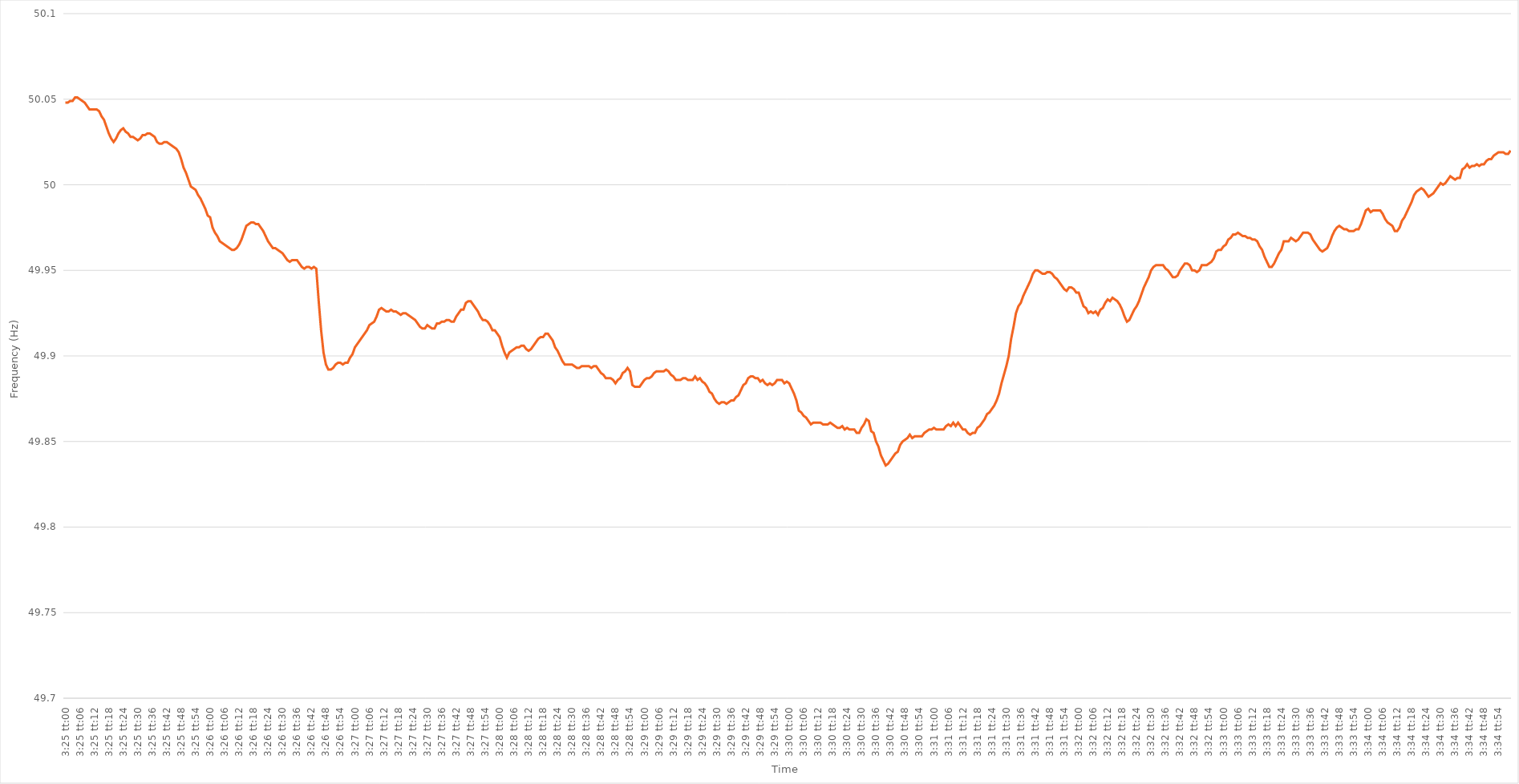
| Category | Series 0 |
|---|---|
| 0.1423611111111111 | 50.048 |
| 0.14237268518518517 | 50.048 |
| 0.14238425925925927 | 50.049 |
| 0.14239583333333333 | 50.049 |
| 0.1424074074074074 | 50.051 |
| 0.1424189814814815 | 50.051 |
| 0.14243055555555556 | 50.05 |
| 0.14244212962962963 | 50.049 |
| 0.1424537037037037 | 50.048 |
| 0.14246527777777776 | 50.046 |
| 0.14247685185185185 | 50.044 |
| 0.14248842592592592 | 50.044 |
| 0.1425 | 50.044 |
| 0.14251157407407408 | 50.044 |
| 0.14252314814814815 | 50.043 |
| 0.14253472222222222 | 50.04 |
| 0.1425462962962963 | 50.038 |
| 0.14255787037037038 | 50.034 |
| 0.14256944444444444 | 50.03 |
| 0.14258101851851854 | 50.027 |
| 0.14259259259259258 | 50.025 |
| 0.14260416666666667 | 50.027 |
| 0.14261574074074074 | 50.03 |
| 0.1426273148148148 | 50.032 |
| 0.1426388888888889 | 50.033 |
| 0.14265046296296297 | 50.031 |
| 0.14266203703703703 | 50.03 |
| 0.14267361111111113 | 50.028 |
| 0.14268518518518516 | 50.028 |
| 0.14269675925925926 | 50.027 |
| 0.14270833333333333 | 50.026 |
| 0.1427199074074074 | 50.027 |
| 0.1427314814814815 | 50.029 |
| 0.14274305555555555 | 50.029 |
| 0.14275462962962962 | 50.03 |
| 0.14276620370370371 | 50.03 |
| 0.14277777777777778 | 50.029 |
| 0.14278935185185185 | 50.028 |
| 0.14280092592592594 | 50.025 |
| 0.1428125 | 50.024 |
| 0.14282407407407408 | 50.024 |
| 0.14283564814814814 | 50.025 |
| 0.1428472222222222 | 50.025 |
| 0.1428587962962963 | 50.024 |
| 0.14287037037037037 | 50.023 |
| 0.14288194444444444 | 50.022 |
| 0.14289351851851853 | 50.021 |
| 0.1429050925925926 | 50.019 |
| 0.14291666666666666 | 50.015 |
| 0.14292824074074073 | 50.01 |
| 0.1429398148148148 | 50.007 |
| 0.1429513888888889 | 50.003 |
| 0.14296296296296296 | 49.999 |
| 0.14297453703703702 | 49.998 |
| 0.14298611111111112 | 49.997 |
| 0.14299768518518519 | 49.994 |
| 0.14300925925925925 | 49.992 |
| 0.14302083333333335 | 49.989 |
| 0.1430324074074074 | 49.986 |
| 0.14304398148148148 | 49.982 |
| 0.14305555555555557 | 49.981 |
| 0.1430671296296296 | 49.975 |
| 0.1430787037037037 | 49.972 |
| 0.14309027777777777 | 49.97 |
| 0.14310185185185184 | 49.967 |
| 0.14311342592592594 | 49.966 |
| 0.143125 | 49.965 |
| 0.14313657407407407 | 49.964 |
| 0.14314814814814816 | 49.963 |
| 0.1431597222222222 | 49.962 |
| 0.1431712962962963 | 49.962 |
| 0.14318287037037036 | 49.963 |
| 0.14319444444444443 | 49.965 |
| 0.14320601851851852 | 49.968 |
| 0.1432175925925926 | 49.972 |
| 0.14322916666666666 | 49.976 |
| 0.14324074074074075 | 49.977 |
| 0.14325231481481482 | 49.978 |
| 0.14326388888888889 | 49.978 |
| 0.14327546296296298 | 49.977 |
| 0.14328703703703705 | 49.977 |
| 0.1432986111111111 | 49.975 |
| 0.14331018518518518 | 49.973 |
| 0.14332175925925925 | 49.97 |
| 0.14333333333333334 | 49.967 |
| 0.1433449074074074 | 49.965 |
| 0.14335648148148147 | 49.963 |
| 0.14336805555555557 | 49.963 |
| 0.14337962962962963 | 49.962 |
| 0.1433912037037037 | 49.961 |
| 0.14340277777777777 | 49.96 |
| 0.14341435185185183 | 49.958 |
| 0.14342592592592593 | 49.956 |
| 0.1434375 | 49.955 |
| 0.14344907407407406 | 49.956 |
| 0.14346064814814816 | 49.956 |
| 0.14347222222222222 | 49.956 |
| 0.1434837962962963 | 49.954 |
| 0.14349537037037038 | 49.952 |
| 0.14350694444444445 | 49.951 |
| 0.14351851851851852 | 49.952 |
| 0.1435300925925926 | 49.952 |
| 0.14354166666666665 | 49.951 |
| 0.14355324074074075 | 49.952 |
| 0.1435648148148148 | 49.951 |
| 0.14357638888888888 | 49.932 |
| 0.14358796296296297 | 49.915 |
| 0.14359953703703704 | 49.902 |
| 0.1436111111111111 | 49.895 |
| 0.1436226851851852 | 49.892 |
| 0.14363425925925924 | 49.892 |
| 0.14364583333333333 | 49.893 |
| 0.1436574074074074 | 49.895 |
| 0.14366898148148147 | 49.896 |
| 0.14368055555555556 | 49.896 |
| 0.14369212962962963 | 49.895 |
| 0.1437037037037037 | 49.896 |
| 0.1437152777777778 | 49.896 |
| 0.14372685185185186 | 49.899 |
| 0.14373842592592592 | 49.901 |
| 0.14375000000000002 | 49.905 |
| 0.14376157407407408 | 49.907 |
| 0.14377314814814815 | 49.909 |
| 0.14378472222222222 | 49.911 |
| 0.14379629629629628 | 49.913 |
| 0.14380787037037038 | 49.915 |
| 0.14381944444444444 | 49.918 |
| 0.1438310185185185 | 49.919 |
| 0.1438425925925926 | 49.92 |
| 0.14385416666666667 | 49.923 |
| 0.14386574074074074 | 49.927 |
| 0.1438773148148148 | 49.928 |
| 0.14388888888888887 | 49.927 |
| 0.14390046296296297 | 49.926 |
| 0.14391203703703703 | 49.926 |
| 0.1439236111111111 | 49.927 |
| 0.1439351851851852 | 49.926 |
| 0.14394675925925926 | 49.926 |
| 0.14395833333333333 | 49.925 |
| 0.14396990740740742 | 49.924 |
| 0.1439814814814815 | 49.925 |
| 0.14399305555555555 | 49.925 |
| 0.14400462962962965 | 49.924 |
| 0.1440162037037037 | 49.923 |
| 0.14402777777777778 | 49.922 |
| 0.14403935185185185 | 49.921 |
| 0.14405092592592592 | 49.919 |
| 0.1440625 | 49.917 |
| 0.14407407407407408 | 49.916 |
| 0.14408564814814814 | 49.916 |
| 0.14409722222222224 | 49.918 |
| 0.14410879629629628 | 49.917 |
| 0.14412037037037037 | 49.916 |
| 0.14413194444444444 | 49.916 |
| 0.1441435185185185 | 49.919 |
| 0.1441550925925926 | 49.919 |
| 0.14416666666666667 | 49.92 |
| 0.14417824074074073 | 49.92 |
| 0.14418981481481483 | 49.921 |
| 0.1442013888888889 | 49.921 |
| 0.14421296296296296 | 49.92 |
| 0.14422453703703705 | 49.92 |
| 0.14423611111111112 | 49.923 |
| 0.1442476851851852 | 49.925 |
| 0.14425925925925925 | 49.927 |
| 0.14427083333333332 | 49.927 |
| 0.14428240740740741 | 49.931 |
| 0.14429398148148148 | 49.932 |
| 0.14430555555555555 | 49.932 |
| 0.14431712962962964 | 49.93 |
| 0.1443287037037037 | 49.928 |
| 0.14434027777777778 | 49.926 |
| 0.14435185185185184 | 49.923 |
| 0.1443634259259259 | 49.921 |
| 0.144375 | 49.921 |
| 0.14438657407407407 | 49.92 |
| 0.14439814814814814 | 49.918 |
| 0.14440972222222223 | 49.915 |
| 0.1444212962962963 | 49.915 |
| 0.14443287037037036 | 49.913 |
| 0.14444444444444446 | 49.911 |
| 0.14445601851851853 | 49.906 |
| 0.1444675925925926 | 49.902 |
| 0.1444791666666667 | 49.899 |
| 0.14449074074074073 | 49.902 |
| 0.14450231481481482 | 49.903 |
| 0.1445138888888889 | 49.904 |
| 0.14452546296296295 | 49.905 |
| 0.14453703703703705 | 49.905 |
| 0.1445486111111111 | 49.906 |
| 0.14456018518518518 | 49.906 |
| 0.14457175925925927 | 49.904 |
| 0.1445833333333333 | 49.903 |
| 0.1445949074074074 | 49.904 |
| 0.14460648148148147 | 49.906 |
| 0.14461805555555554 | 49.908 |
| 0.14462962962962964 | 49.91 |
| 0.1446412037037037 | 49.911 |
| 0.14465277777777777 | 49.911 |
| 0.14466435185185186 | 49.913 |
| 0.14467592592592593 | 49.913 |
| 0.1446875 | 49.911 |
| 0.1446990740740741 | 49.909 |
| 0.14471064814814816 | 49.905 |
| 0.14472222222222222 | 49.903 |
| 0.1447337962962963 | 49.9 |
| 0.14474537037037036 | 49.897 |
| 0.14475694444444445 | 49.895 |
| 0.14476851851851852 | 49.895 |
| 0.14478009259259259 | 49.895 |
| 0.14479166666666668 | 49.895 |
| 0.14480324074074075 | 49.894 |
| 0.1448148148148148 | 49.893 |
| 0.14482638888888888 | 49.893 |
| 0.14483796296296295 | 49.894 |
| 0.14484953703703704 | 49.894 |
| 0.1448611111111111 | 49.894 |
| 0.14487268518518517 | 49.894 |
| 0.14488425925925927 | 49.893 |
| 0.14489583333333333 | 49.894 |
| 0.1449074074074074 | 49.894 |
| 0.1449189814814815 | 49.892 |
| 0.14493055555555556 | 49.89 |
| 0.14494212962962963 | 49.889 |
| 0.14495370370370372 | 49.887 |
| 0.14496527777777776 | 49.887 |
| 0.14497685185185186 | 49.887 |
| 0.14498842592592592 | 49.886 |
| 0.145 | 49.884 |
| 0.14501157407407408 | 49.886 |
| 0.14502314814814815 | 49.887 |
| 0.14503472222222222 | 49.89 |
| 0.1450462962962963 | 49.891 |
| 0.14505787037037035 | 49.893 |
| 0.14506944444444445 | 49.891 |
| 0.1450810185185185 | 49.883 |
| 0.14509259259259258 | 49.882 |
| 0.14510416666666667 | 49.882 |
| 0.14511574074074074 | 49.882 |
| 0.1451273148148148 | 49.884 |
| 0.1451388888888889 | 49.886 |
| 0.14515046296296297 | 49.887 |
| 0.14516203703703703 | 49.887 |
| 0.14517361111111113 | 49.888 |
| 0.1451851851851852 | 49.89 |
| 0.14519675925925926 | 49.891 |
| 0.14520833333333333 | 49.891 |
| 0.1452199074074074 | 49.891 |
| 0.1452314814814815 | 49.891 |
| 0.14524305555555556 | 49.892 |
| 0.14525462962962962 | 49.891 |
| 0.14526620370370372 | 49.889 |
| 0.14527777777777778 | 49.888 |
| 0.14528935185185185 | 49.886 |
| 0.14530092592592592 | 49.886 |
| 0.14531249999999998 | 49.886 |
| 0.14532407407407408 | 49.887 |
| 0.14533564814814814 | 49.887 |
| 0.1453472222222222 | 49.886 |
| 0.1453587962962963 | 49.886 |
| 0.14537037037037037 | 49.886 |
| 0.14538194444444444 | 49.888 |
| 0.14539351851851853 | 49.886 |
| 0.1454050925925926 | 49.887 |
| 0.14541666666666667 | 49.885 |
| 0.14542824074074076 | 49.884 |
| 0.1454398148148148 | 49.882 |
| 0.1454513888888889 | 49.879 |
| 0.14546296296296296 | 49.878 |
| 0.14547453703703703 | 49.875 |
| 0.14548611111111112 | 49.873 |
| 0.1454976851851852 | 49.872 |
| 0.14550925925925925 | 49.873 |
| 0.14552083333333335 | 49.873 |
| 0.1455324074074074 | 49.872 |
| 0.14554398148148148 | 49.873 |
| 0.14555555555555555 | 49.874 |
| 0.14556712962962962 | 49.874 |
| 0.1455787037037037 | 49.876 |
| 0.14559027777777778 | 49.877 |
| 0.14560185185185184 | 49.88 |
| 0.14561342592592594 | 49.883 |
| 0.145625 | 49.884 |
| 0.14563657407407407 | 49.887 |
| 0.14564814814814817 | 49.888 |
| 0.14565972222222223 | 49.888 |
| 0.1456712962962963 | 49.887 |
| 0.14568287037037037 | 49.887 |
| 0.14569444444444443 | 49.885 |
| 0.14570601851851853 | 49.886 |
| 0.1457175925925926 | 49.884 |
| 0.14572916666666666 | 49.883 |
| 0.14574074074074075 | 49.884 |
| 0.14575231481481482 | 49.883 |
| 0.1457638888888889 | 49.884 |
| 0.14577546296296295 | 49.886 |
| 0.14578703703703702 | 49.886 |
| 0.14579861111111111 | 49.886 |
| 0.14581018518518518 | 49.884 |
| 0.14582175925925925 | 49.885 |
| 0.14583333333333334 | 49.884 |
| 0.1458449074074074 | 49.881 |
| 0.14585648148148148 | 49.878 |
| 0.14586805555555557 | 49.874 |
| 0.14587962962962964 | 49.868 |
| 0.1458912037037037 | 49.867 |
| 0.1459027777777778 | 49.865 |
| 0.14591435185185184 | 49.864 |
| 0.14592592592592593 | 49.862 |
| 0.1459375 | 49.86 |
| 0.14594907407407406 | 49.861 |
| 0.14596064814814816 | 49.861 |
| 0.14597222222222223 | 49.861 |
| 0.1459837962962963 | 49.861 |
| 0.1459953703703704 | 49.86 |
| 0.14600694444444443 | 49.86 |
| 0.14601851851851852 | 49.86 |
| 0.1460300925925926 | 49.861 |
| 0.14604166666666665 | 49.86 |
| 0.14605324074074075 | 49.859 |
| 0.14606481481481481 | 49.858 |
| 0.14607638888888888 | 49.858 |
| 0.14608796296296298 | 49.859 |
| 0.14609953703703704 | 49.857 |
| 0.1461111111111111 | 49.858 |
| 0.1461226851851852 | 49.857 |
| 0.14613425925925927 | 49.857 |
| 0.14614583333333334 | 49.857 |
| 0.1461574074074074 | 49.855 |
| 0.14616898148148147 | 49.855 |
| 0.14618055555555556 | 49.858 |
| 0.14619212962962963 | 49.86 |
| 0.1462037037037037 | 49.863 |
| 0.1462152777777778 | 49.862 |
| 0.14622685185185186 | 49.856 |
| 0.14623842592592592 | 49.855 |
| 0.14625 | 49.85 |
| 0.14626157407407406 | 49.847 |
| 0.14627314814814815 | 49.842 |
| 0.14628472222222222 | 49.839 |
| 0.14629629629629629 | 49.836 |
| 0.14630787037037038 | 49.837 |
| 0.14631944444444445 | 49.839 |
| 0.1463310185185185 | 49.841 |
| 0.1463425925925926 | 49.843 |
| 0.14635416666666667 | 49.844 |
| 0.14636574074074074 | 49.848 |
| 0.14637731481481484 | 49.85 |
| 0.14638888888888887 | 49.851 |
| 0.14640046296296297 | 49.852 |
| 0.14641203703703703 | 49.854 |
| 0.1464236111111111 | 49.852 |
| 0.1464351851851852 | 49.853 |
| 0.14644675925925926 | 49.853 |
| 0.14645833333333333 | 49.853 |
| 0.14646990740740742 | 49.853 |
| 0.14648148148148146 | 49.855 |
| 0.14649305555555556 | 49.856 |
| 0.14650462962962962 | 49.857 |
| 0.1465162037037037 | 49.857 |
| 0.14652777777777778 | 49.858 |
| 0.14653935185185185 | 49.857 |
| 0.14655092592592592 | 49.857 |
| 0.1465625 | 49.857 |
| 0.14657407407407408 | 49.857 |
| 0.14658564814814815 | 49.859 |
| 0.14659722222222224 | 49.86 |
| 0.1466087962962963 | 49.859 |
| 0.14662037037037037 | 49.861 |
| 0.14663194444444444 | 49.859 |
| 0.1466435185185185 | 49.861 |
| 0.1466550925925926 | 49.859 |
| 0.14666666666666667 | 49.857 |
| 0.14667824074074073 | 49.857 |
| 0.14668981481481483 | 49.855 |
| 0.1467013888888889 | 49.854 |
| 0.14671296296296296 | 49.855 |
| 0.14672453703703703 | 49.855 |
| 0.1467361111111111 | 49.858 |
| 0.1467476851851852 | 49.859 |
| 0.14675925925925926 | 49.861 |
| 0.14677083333333332 | 49.863 |
| 0.14678240740740742 | 49.866 |
| 0.14679398148148148 | 49.867 |
| 0.14680555555555555 | 49.869 |
| 0.14681712962962964 | 49.871 |
| 0.1468287037037037 | 49.874 |
| 0.14684027777777778 | 49.878 |
| 0.14685185185185184 | 49.884 |
| 0.1468634259259259 | 49.889 |
| 0.146875 | 49.894 |
| 0.14688657407407407 | 49.9 |
| 0.14689814814814814 | 49.91 |
| 0.14690972222222223 | 49.917 |
| 0.1469212962962963 | 49.925 |
| 0.14693287037037037 | 49.929 |
| 0.14694444444444446 | 49.931 |
| 0.1469560185185185 | 49.935 |
| 0.1469675925925926 | 49.938 |
| 0.14697916666666666 | 49.941 |
| 0.14699074074074073 | 49.944 |
| 0.14700231481481482 | 49.948 |
| 0.1470138888888889 | 49.95 |
| 0.14702546296296296 | 49.95 |
| 0.14703703703703705 | 49.949 |
| 0.14704861111111112 | 49.948 |
| 0.14706018518518518 | 49.948 |
| 0.14707175925925928 | 49.949 |
| 0.14708333333333334 | 49.949 |
| 0.1470949074074074 | 49.948 |
| 0.14710648148148148 | 49.946 |
| 0.14711805555555554 | 49.945 |
| 0.14712962962962964 | 49.943 |
| 0.1471412037037037 | 49.941 |
| 0.14715277777777777 | 49.939 |
| 0.14716435185185187 | 49.938 |
| 0.14717592592592593 | 49.94 |
| 0.1471875 | 49.94 |
| 0.14719907407407407 | 49.939 |
| 0.14721064814814813 | 49.937 |
| 0.14722222222222223 | 49.937 |
| 0.1472337962962963 | 49.933 |
| 0.14724537037037036 | 49.929 |
| 0.14725694444444445 | 49.928 |
| 0.14726851851851852 | 49.925 |
| 0.1472800925925926 | 49.926 |
| 0.14729166666666668 | 49.925 |
| 0.14730324074074075 | 49.926 |
| 0.14731481481481482 | 49.924 |
| 0.14732638888888888 | 49.927 |
| 0.14733796296296295 | 49.928 |
| 0.14734953703703704 | 49.931 |
| 0.1473611111111111 | 49.933 |
| 0.14737268518518518 | 49.932 |
| 0.14738425925925927 | 49.934 |
| 0.14739583333333334 | 49.933 |
| 0.1474074074074074 | 49.932 |
| 0.14741898148148147 | 49.93 |
| 0.14743055555555554 | 49.927 |
| 0.14744212962962963 | 49.923 |
| 0.1474537037037037 | 49.92 |
| 0.14746527777777776 | 49.921 |
| 0.14747685185185186 | 49.924 |
| 0.14748842592592593 | 49.927 |
| 0.1475 | 49.929 |
| 0.1475115740740741 | 49.932 |
| 0.14752314814814815 | 49.936 |
| 0.14753472222222222 | 49.94 |
| 0.14754629629629631 | 49.943 |
| 0.14755787037037038 | 49.946 |
| 0.14756944444444445 | 49.95 |
| 0.14758101851851851 | 49.952 |
| 0.14759259259259258 | 49.953 |
| 0.14760416666666668 | 49.953 |
| 0.14761574074074074 | 49.953 |
| 0.1476273148148148 | 49.953 |
| 0.1476388888888889 | 49.951 |
| 0.14765046296296297 | 49.95 |
| 0.14766203703703704 | 49.948 |
| 0.1476736111111111 | 49.946 |
| 0.14768518518518517 | 49.946 |
| 0.14769675925925926 | 49.947 |
| 0.14770833333333333 | 49.95 |
| 0.1477199074074074 | 49.952 |
| 0.1477314814814815 | 49.954 |
| 0.14774305555555556 | 49.954 |
| 0.14775462962962962 | 49.953 |
| 0.14776620370370372 | 49.95 |
| 0.14777777777777779 | 49.95 |
| 0.14778935185185185 | 49.949 |
| 0.14780092592592595 | 49.95 |
| 0.14781249999999999 | 49.953 |
| 0.14782407407407408 | 49.953 |
| 0.14783564814814815 | 49.953 |
| 0.1478472222222222 | 49.954 |
| 0.1478587962962963 | 49.955 |
| 0.14787037037037037 | 49.957 |
| 0.14788194444444444 | 49.961 |
| 0.14789351851851854 | 49.962 |
| 0.14790509259259257 | 49.962 |
| 0.14791666666666667 | 49.964 |
| 0.14792824074074074 | 49.965 |
| 0.1479398148148148 | 49.968 |
| 0.1479513888888889 | 49.969 |
| 0.14796296296296296 | 49.971 |
| 0.14797453703703703 | 49.971 |
| 0.14798611111111112 | 49.972 |
| 0.1479976851851852 | 49.971 |
| 0.14800925925925926 | 49.97 |
| 0.14802083333333335 | 49.97 |
| 0.1480324074074074 | 49.969 |
| 0.14804398148148148 | 49.969 |
| 0.14805555555555555 | 49.968 |
| 0.14806712962962962 | 49.968 |
| 0.1480787037037037 | 49.967 |
| 0.14809027777777778 | 49.964 |
| 0.14810185185185185 | 49.962 |
| 0.14811342592592594 | 49.958 |
| 0.14812499999999998 | 49.955 |
| 0.14813657407407407 | 49.952 |
| 0.14814814814814814 | 49.952 |
| 0.1481597222222222 | 49.954 |
| 0.1481712962962963 | 49.957 |
| 0.14818287037037037 | 49.96 |
| 0.14819444444444443 | 49.962 |
| 0.14820601851851853 | 49.967 |
| 0.1482175925925926 | 49.967 |
| 0.14822916666666666 | 49.967 |
| 0.14824074074074076 | 49.969 |
| 0.14825231481481482 | 49.968 |
| 0.1482638888888889 | 49.967 |
| 0.14827546296296296 | 49.968 |
| 0.14828703703703702 | 49.97 |
| 0.14829861111111112 | 49.972 |
| 0.14831018518518518 | 49.972 |
| 0.14832175925925925 | 49.972 |
| 0.14833333333333334 | 49.971 |
| 0.1483449074074074 | 49.968 |
| 0.14835648148148148 | 49.966 |
| 0.14836805555555554 | 49.964 |
| 0.1483796296296296 | 49.962 |
| 0.1483912037037037 | 49.961 |
| 0.14840277777777777 | 49.962 |
| 0.14841435185185184 | 49.963 |
| 0.14842592592592593 | 49.966 |
| 0.1484375 | 49.97 |
| 0.14844907407407407 | 49.973 |
| 0.14846064814814816 | 49.975 |
| 0.14847222222222223 | 49.976 |
| 0.1484837962962963 | 49.975 |
| 0.1484953703703704 | 49.974 |
| 0.14850694444444446 | 49.974 |
| 0.14851851851851852 | 49.973 |
| 0.1485300925925926 | 49.973 |
| 0.14854166666666666 | 49.973 |
| 0.14855324074074075 | 49.974 |
| 0.14856481481481482 | 49.974 |
| 0.14857638888888888 | 49.977 |
| 0.14858796296296298 | 49.981 |
| 0.14859953703703704 | 49.985 |
| 0.1486111111111111 | 49.986 |
| 0.14862268518518518 | 49.984 |
| 0.14863425925925924 | 49.985 |
| 0.14864583333333334 | 49.985 |
| 0.1486574074074074 | 49.985 |
| 0.14866898148148147 | 49.985 |
| 0.14868055555555557 | 49.983 |
| 0.14869212962962963 | 49.98 |
| 0.1487037037037037 | 49.978 |
| 0.1487152777777778 | 49.977 |
| 0.14872685185185186 | 49.976 |
| 0.14873842592592593 | 49.973 |
| 0.14875000000000002 | 49.973 |
| 0.14876157407407406 | 49.975 |
| 0.14877314814814815 | 49.979 |
| 0.14878472222222222 | 49.981 |
| 0.1487962962962963 | 49.984 |
| 0.14880787037037038 | 49.987 |
| 0.14881944444444445 | 49.99 |
| 0.14883101851851852 | 49.994 |
| 0.1488425925925926 | 49.996 |
| 0.14885416666666665 | 49.997 |
| 0.14886574074074074 | 49.998 |
| 0.1488773148148148 | 49.997 |
| 0.14888888888888888 | 49.995 |
| 0.14890046296296297 | 49.993 |
| 0.14891203703703704 | 49.994 |
| 0.1489236111111111 | 49.995 |
| 0.1489351851851852 | 49.997 |
| 0.14894675925925926 | 49.999 |
| 0.14895833333333333 | 50.001 |
| 0.14896990740740743 | 50 |
| 0.14898148148148146 | 50.001 |
| 0.14899305555555556 | 50.003 |
| 0.14900462962962963 | 50.005 |
| 0.1490162037037037 | 50.004 |
| 0.1490277777777778 | 50.003 |
| 0.14903935185185185 | 50.004 |
| 0.14905092592592592 | 50.004 |
| 0.14906250000000001 | 50.009 |
| 0.14907407407407405 | 50.01 |
| 0.14908564814814815 | 50.012 |
| 0.14909722222222221 | 50.01 |
| 0.14910879629629628 | 50.011 |
| 0.14912037037037038 | 50.011 |
| 0.14913194444444444 | 50.012 |
| 0.1491435185185185 | 50.011 |
| 0.1491550925925926 | 50.012 |
| 0.14916666666666667 | 50.012 |
| 0.14917824074074074 | 50.014 |
| 0.14918981481481483 | 50.015 |
| 0.1492013888888889 | 50.015 |
| 0.14921296296296296 | 50.017 |
| 0.14922453703703703 | 50.018 |
| 0.1492361111111111 | 50.019 |
| 0.1492476851851852 | 50.019 |
| 0.14925925925925926 | 50.019 |
| 0.14927083333333332 | 50.018 |
| 0.14928240740740742 | 50.018 |
| 0.14929398148148149 | 50.02 |